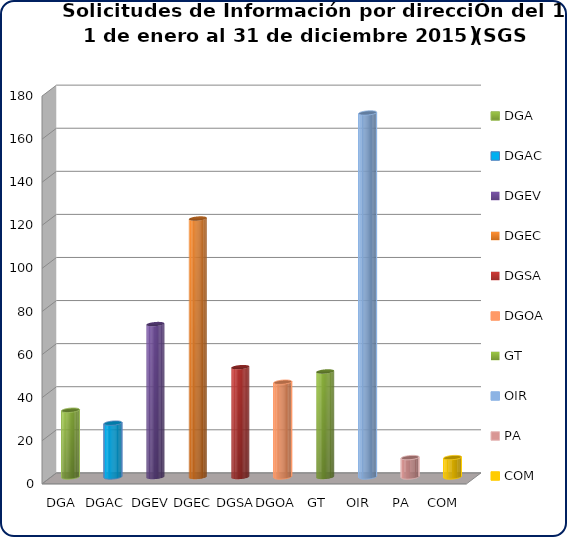
| Category | Número de solicitudes |
|---|---|
| DGA | 31 |
| DGAC | 25 |
| DGEV | 71 |
| DGEC | 120 |
| DGSA | 51 |
| DGOA | 44 |
| GT | 49 |
| OIR | 169 |
| PA | 9 |
| COM | 9 |